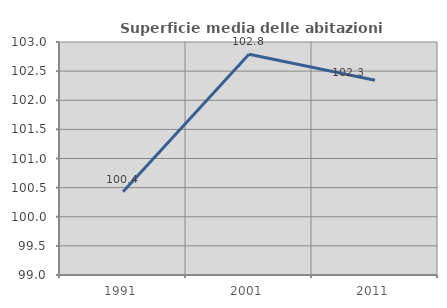
| Category | Superficie media delle abitazioni occupate |
|---|---|
| 1991.0 | 100.43 |
| 2001.0 | 102.791 |
| 2011.0 | 102.342 |